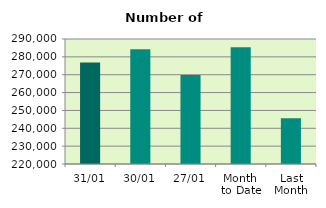
| Category | Series 0 |
|---|---|
| 31/01 | 276806 |
| 30/01 | 284234 |
| 27/01 | 269842 |
| Month 
to Date | 285405.636 |
| Last
Month | 245553.619 |